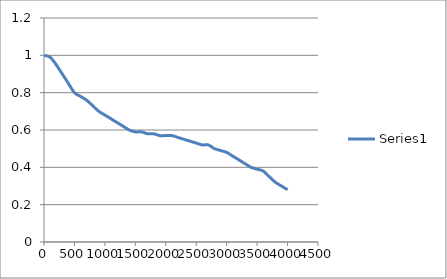
| Category | Series 0 |
|---|---|
| 1.0 | 1 |
| 100.0 | 0.99 |
| 200.0 | 0.95 |
| 300.0 | 0.9 |
| 400.0 | 0.85 |
| 500.0 | 0.8 |
| 600.0 | 0.78 |
| 700.0 | 0.76 |
| 800.0 | 0.73 |
| 900.0 | 0.7 |
| 1000.0 | 0.68 |
| 1100.0 | 0.66 |
| 1200.0 | 0.64 |
| 1300.0 | 0.62 |
| 1400.0 | 0.6 |
| 1500.0 | 0.59 |
| 1600.0 | 0.59 |
| 1700.0 | 0.58 |
| 1800.0 | 0.58 |
| 1900.0 | 0.57 |
| 2000.0 | 0.57 |
| 2100.0 | 0.57 |
| 2200.0 | 0.56 |
| 2300.0 | 0.55 |
| 2400.0 | 0.54 |
| 2500.0 | 0.53 |
| 2600.0 | 0.52 |
| 2700.0 | 0.52 |
| 2800.0 | 0.5 |
| 2900.0 | 0.49 |
| 3000.0 | 0.48 |
| 3100.0 | 0.46 |
| 3200.0 | 0.44 |
| 3300.0 | 0.42 |
| 3400.0 | 0.4 |
| 3500.0 | 0.39 |
| 3600.0 | 0.38 |
| 3700.0 | 0.35 |
| 3800.0 | 0.32 |
| 3900.0 | 0.3 |
| 4000.0 | 0.28 |